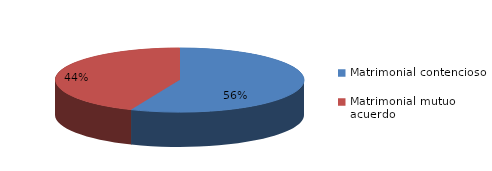
| Category | Series 0 |
|---|---|
| 0 | 885 |
| 1 | 686 |